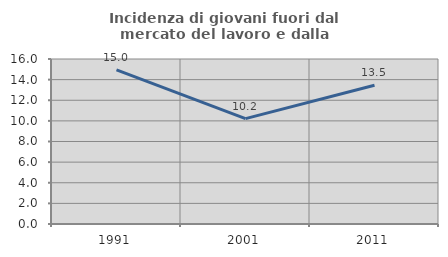
| Category | Incidenza di giovani fuori dal mercato del lavoro e dalla formazione  |
|---|---|
| 1991.0 | 14.95 |
| 2001.0 | 10.222 |
| 2011.0 | 13.462 |